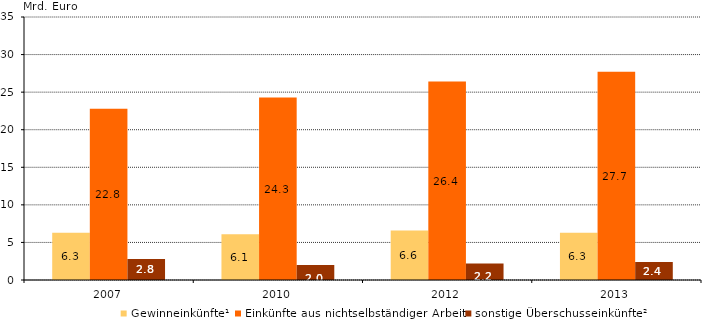
| Category | Gewinneinkünfte¹ | Einkünfte aus nichtselbständiger Arbeit | sonstige Überschusseinkünfte² |
|---|---|---|---|
| 2007.0 | 6.3 | 22.8 | 2.8 |
| 2010.0 | 6.1 | 24.3 | 2 |
| 2012.0 | 6.6 | 26.4 | 2.2 |
| 2013.0 | 6.3 | 27.7 | 2.4 |